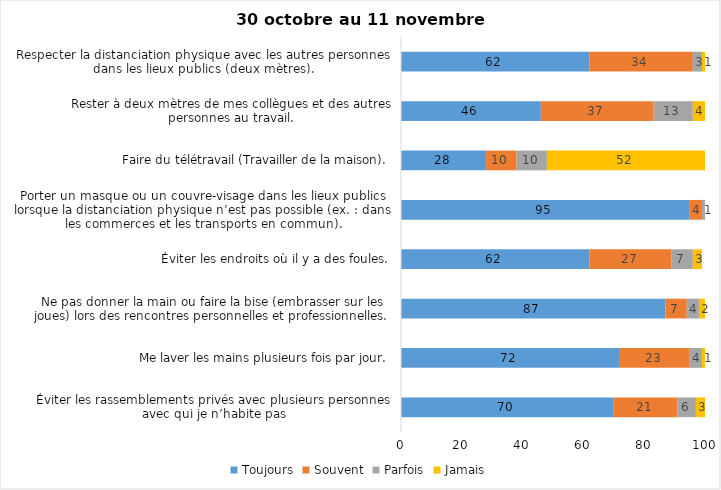
| Category | Toujours | Souvent | Parfois | Jamais |
|---|---|---|---|---|
| Éviter les rassemblements privés avec plusieurs personnes avec qui je n’habite pas | 70 | 21 | 6 | 3 |
| Me laver les mains plusieurs fois par jour. | 72 | 23 | 4 | 1 |
| Ne pas donner la main ou faire la bise (embrasser sur les joues) lors des rencontres personnelles et professionnelles. | 87 | 7 | 4 | 2 |
| Éviter les endroits où il y a des foules. | 62 | 27 | 7 | 3 |
| Porter un masque ou un couvre-visage dans les lieux publics lorsque la distanciation physique n’est pas possible (ex. : dans les commerces et les transports en commun). | 95 | 4 | 1 | 0 |
| Faire du télétravail (Travailler de la maison). | 28 | 10 | 10 | 52 |
| Rester à deux mètres de mes collègues et des autres personnes au travail. | 46 | 37 | 13 | 4 |
| Respecter la distanciation physique avec les autres personnes dans les lieux publics (deux mètres). | 62 | 34 | 3 | 1 |